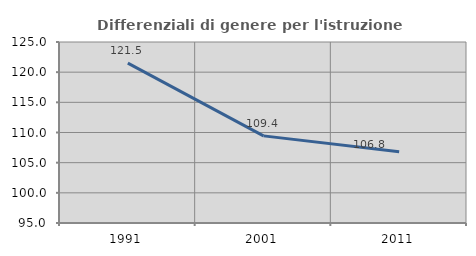
| Category | Differenziali di genere per l'istruzione superiore |
|---|---|
| 1991.0 | 121.496 |
| 2001.0 | 109.441 |
| 2011.0 | 106.803 |